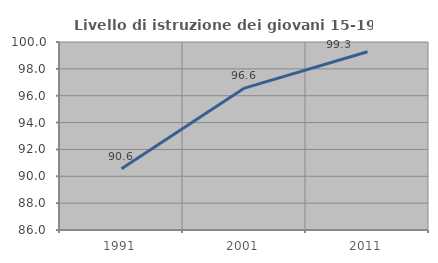
| Category | Livello di istruzione dei giovani 15-19 anni |
|---|---|
| 1991.0 | 90.56 |
| 2001.0 | 96.568 |
| 2011.0 | 99.276 |